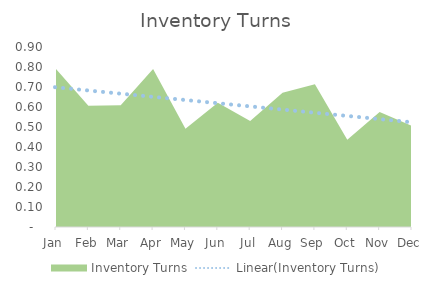
| Category | Inventory Turns |
|---|---|
| Jan | 0.79 |
| Feb | 0.606 |
| Mar | 0.609 |
| Apr | 0.789 |
| May | 0.492 |
| Jun | 0.621 |
| Jul | 0.529 |
| Aug | 0.672 |
| Sep | 0.714 |
| Oct | 0.437 |
| Nov | 0.575 |
| Dec | 0.505 |